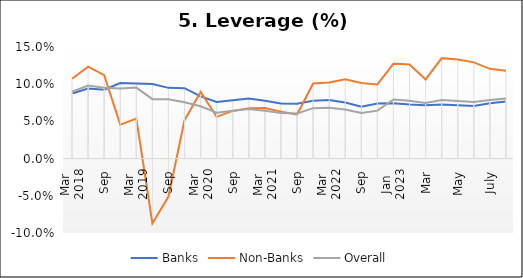
| Category | Banks | Non-Banks | Overall |
|---|---|---|---|
| 0 | 0.088 | 0.107 | 0.09 |
| 1 | 0.094 | 0.123 | 0.098 |
| 2 | 0.093 | 0.112 | 0.095 |
| 3 | 0.102 | 0.046 | 0.094 |
| 4 | 0.101 | 0.054 | 0.095 |
| 5 | 0.1 | -0.087 | 0.08 |
| 6 | 0.095 | -0.051 | 0.08 |
| 7 | 0.095 | 0.052 | 0.076 |
| 8 | 0.084 | 0.09 | 0.07 |
| 9 | 0.076 | 0.056 | 0.062 |
| 10 | 0.079 | 0.064 | 0.064 |
| 11 | 0.081 | 0.068 | 0.067 |
| 12 | 0.078 | 0.068 | 0.064 |
| 13 | 0.074 | 0.063 | 0.061 |
| 14 | 0.074 | 0.059 | 0.061 |
| 15 | 0.078 | 0.101 | 0.068 |
| 16 | 0.079 | 0.102 | 0.068 |
| 17 | 0.075 | 0.106 | 0.066 |
| 18 | 0.07 | 0.102 | 0.061 |
| 19 | 0.074 | 0.1 | 0.064 |
| 20 | 0.074 | 0.128 | 0.079 |
| 21 | 0.073 | 0.126 | 0.078 |
| 22 | 0.072 | 0.106 | 0.075 |
| 23 | 0.073 | 0.135 | 0.079 |
| 24 | 0.072 | 0.133 | 0.077 |
| 25 | 0.071 | 0.129 | 0.076 |
| 26 | 0.074 | 0.121 | 0.079 |
| 27 | 0.077 | 0.118 | 0.081 |